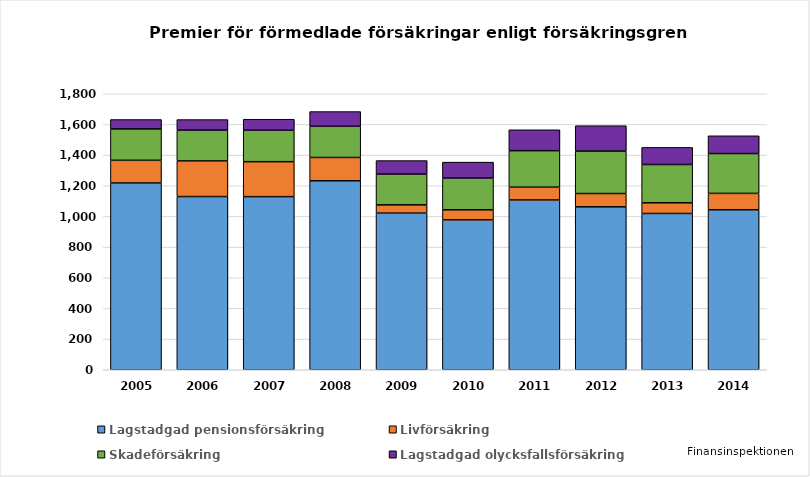
| Category | Lagstadgad pensionsförsäkring | Livförsäkring | Skadeförsäkring | Lagstadgad olycksfallsförsäkring |
|---|---|---|---|---|
| 2005.0 | 1218 | 148 | 205 | 61 |
| 2006.0 | 1129.49 | 232.47 | 201.056 | 68.612 |
| 2007.0 | 1129 | 228 | 205 | 72 |
| 2008.0 | 1232.449 | 151.996 | 203.425 | 95.962 |
| 2009.0 | 1021.457 | 54.107 | 200.56 | 88.041 |
| 2010.0 | 977.321 | 65.95 | 207.341 | 103.558 |
| 2011.0 | 1107.329 | 83.403 | 238.041 | 136.289 |
| 2012.0 | 1062.705 | 86.597 | 276.62 | 165.706 |
| 2013.0 | 1019.216 | 69.648 | 249.823 | 111.515 |
| 2014.0 | 1043.573 | 106.619 | 259.835 | 115.957 |